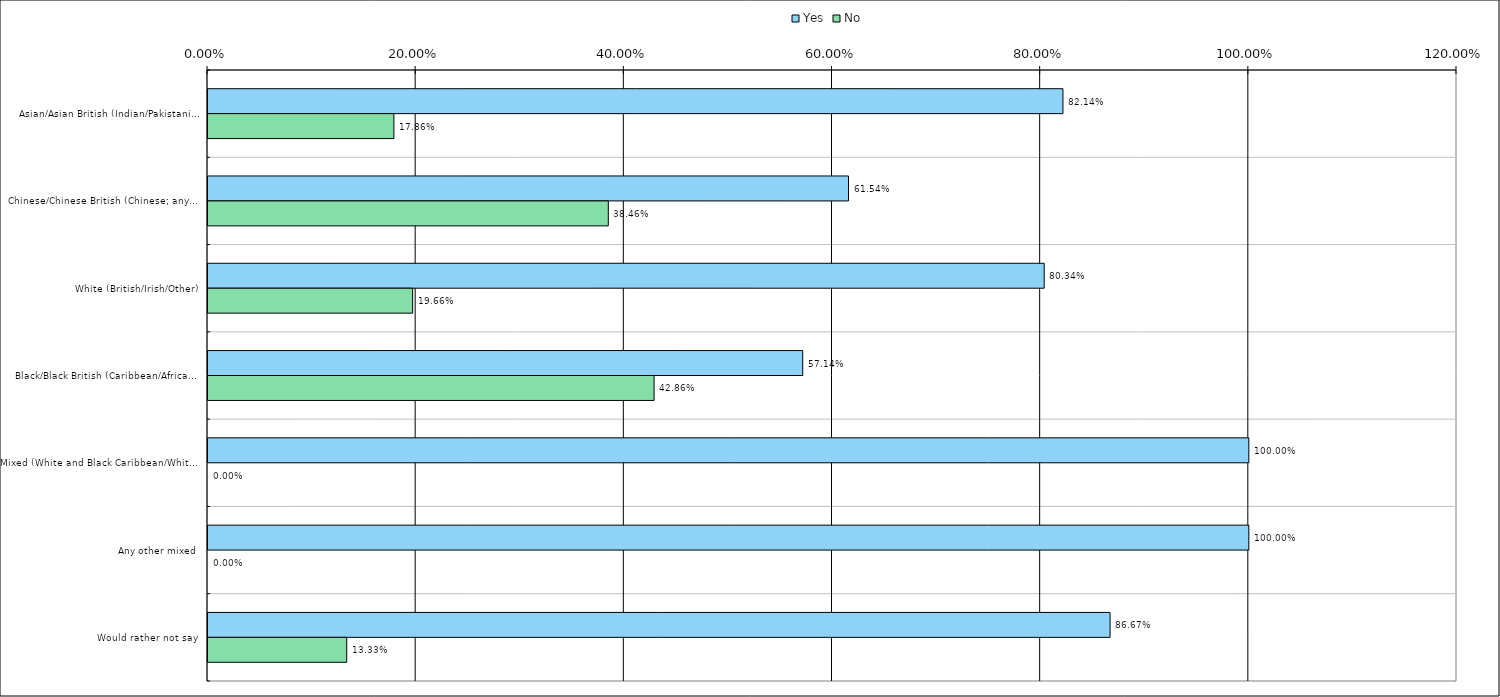
| Category | Yes | No |
|---|---|---|
| 0 | 0.821 | 0.179 |
| 1 | 0.615 | 0.385 |
| 2 | 0.803 | 0.197 |
| 3 | 0.571 | 0.429 |
| 4 | 1 | 0 |
| 5 | 1 | 0 |
| 6 | 0.867 | 0.133 |